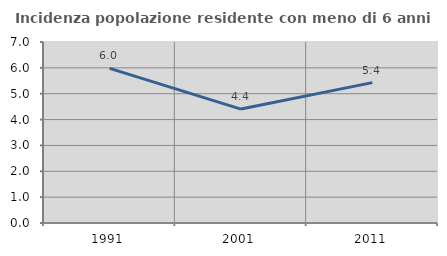
| Category | Incidenza popolazione residente con meno di 6 anni |
|---|---|
| 1991.0 | 5.982 |
| 2001.0 | 4.405 |
| 2011.0 | 5.428 |